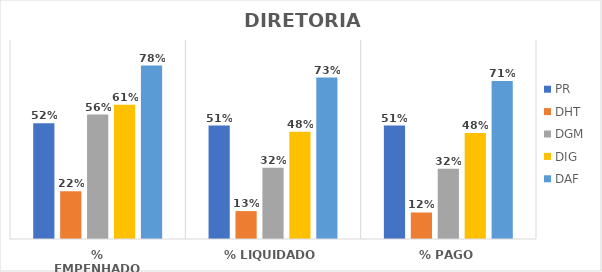
| Category | PR | DHT | DGM | DIG | DAF |
|---|---|---|---|---|---|
| % EMPENHADO | 0.523 | 0.215 | 0.563 | 0.607 | 0.785 |
| % LIQUIDADO | 0.513 | 0.126 | 0.322 | 0.485 | 0.73 |
| % PAGO | 0.513 | 0.12 | 0.317 | 0.479 | 0.714 |